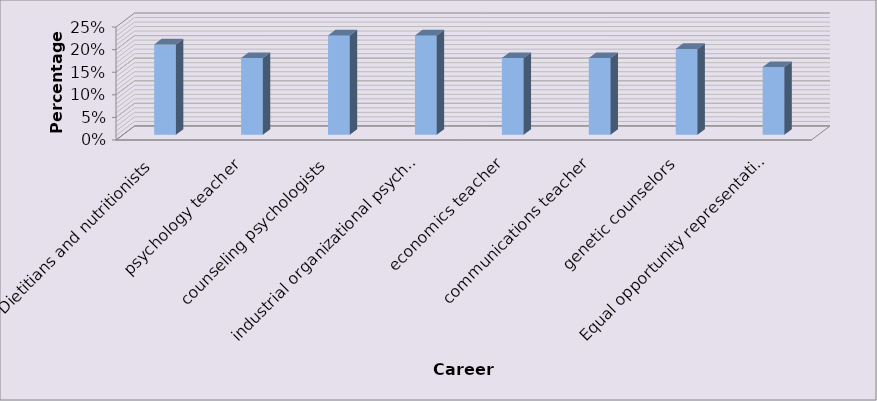
| Category | percentage growth  |
|---|---|
| Dietitians and nutritionists | 0.2 |
| psychology teacher | 0.17 |
| counseling psychologists | 0.22 |
| industrial organizational psychologists | 0.22 |
| economics teacher | 0.17 |
| communications teacher | 0.17 |
| genetic counselors | 0.19 |
| Equal opportunity representatives and officers  | 0.15 |